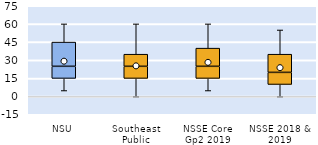
| Category | 25th | 50th | 75th |
|---|---|---|---|
| NSU | 15 | 10 | 20 |
| Southeast Public | 15 | 10 | 10 |
| NSSE Core Gp2 2019 | 15 | 10 | 15 |
| NSSE 2018 & 2019 | 10 | 10 | 15 |